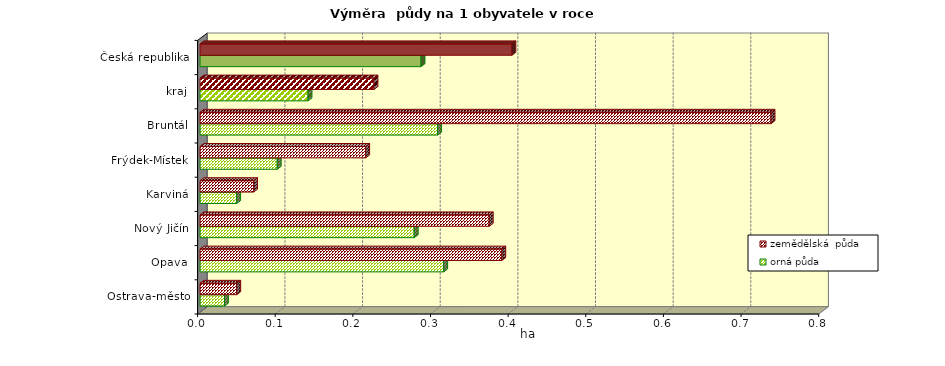
| Category | orná půda | zemědělská  půda |
|---|---|---|
| Ostrava-město | 0.031 | 0.047 |
| Opava | 0.314 | 0.389 |
| Nový Jičín | 0.276 | 0.373 |
| Karviná | 0.047 | 0.069 |
| Frýdek-Místek | 0.099 | 0.213 |
| Bruntál | 0.306 | 0.735 |
| kraj | 0.139 | 0.224 |
| Česká republika | 0.285 | 0.402 |